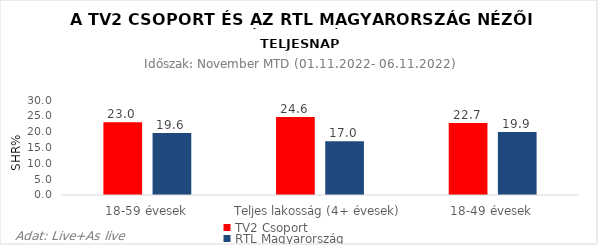
| Category | TV2 Csoport | RTL Magyarország |
|---|---|---|
| 18-59 évesek | 23 | 19.6 |
| Teljes lakosság (4+ évesek) | 24.6 | 17 |
| 18-49 évesek | 22.7 | 19.9 |